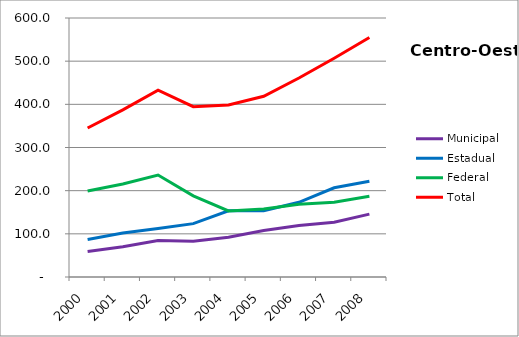
| Category | Municipal | Estadual | Federal | Total |
|---|---|---|---|---|
| 2000.0 | 59.2 | 86.7 | 199.3 | 345.2 |
| 2001.0 | 70 | 101.9 | 215.3 | 387.3 |
| 2002.0 | 84.4 | 112.2 | 236.2 | 432.8 |
| 2003.0 | 83.1 | 123.6 | 187.9 | 394.6 |
| 2004.0 | 92 | 153.5 | 152.9 | 398.4 |
| 2005.0 | 107.5 | 153.5 | 157.7 | 418.7 |
| 2006.0 | 119.3 | 173 | 168.6 | 460.9 |
| 2007.0 | 126.8 | 206.7 | 173.3 | 506.8 |
| 2008.0 | 145.7 | 221.6 | 187.3 | 554.7 |